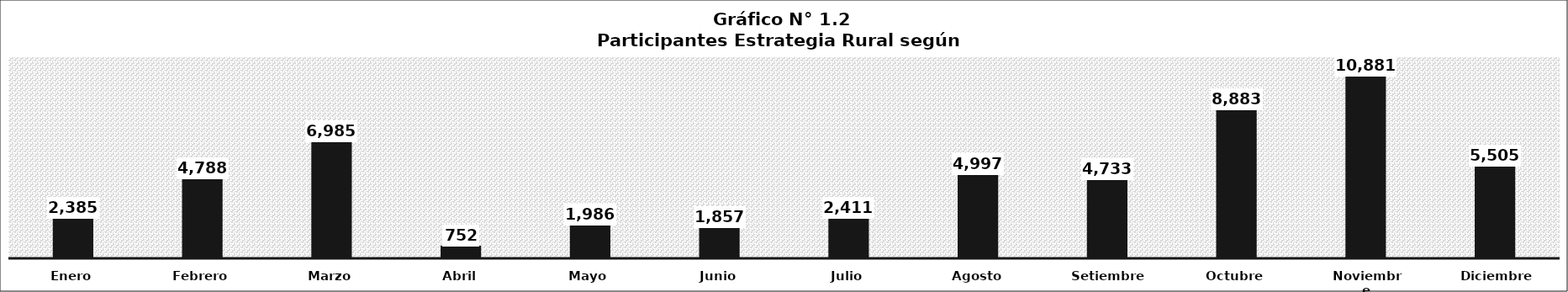
| Category | Series 0 |
|---|---|
| Enero | 2385 |
| Febrero | 4788 |
| Marzo | 6985 |
| Abril | 752 |
| Mayo | 1986 |
| Junio | 1857 |
| Julio | 2411 |
| Agosto | 4997 |
| Setiembre | 4733 |
| Octubre | 8883 |
| Noviembre | 10881 |
| Diciembre | 5505 |